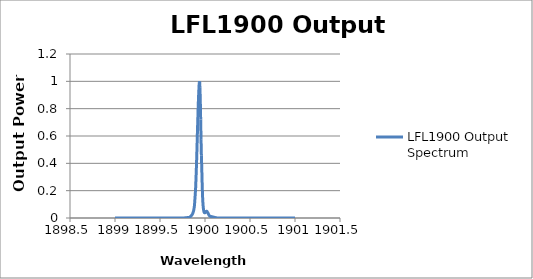
| Category | LFL1900 Output Spectrum |
|---|---|
| 1899.0 | 0 |
| 1899.004 | 0 |
| 1899.008 | 0 |
| 1899.012 | 0 |
| 1899.016 | 0 |
| 1899.02 | 0 |
| 1899.024 | 0 |
| 1899.028 | 0 |
| 1899.032 | 0 |
| 1899.036 | 0 |
| 1899.04 | 0 |
| 1899.044 | 0 |
| 1899.048 | 0 |
| 1899.052 | 0 |
| 1899.056 | 0 |
| 1899.06 | 0 |
| 1899.064 | 0 |
| 1899.068 | 0 |
| 1899.072 | 0 |
| 1899.076 | 0 |
| 1899.08 | 0 |
| 1899.084 | 0 |
| 1899.088 | 0 |
| 1899.092 | 0 |
| 1899.096 | 0 |
| 1899.1 | 0 |
| 1899.104 | 0 |
| 1899.108 | 0 |
| 1899.112 | 0 |
| 1899.116 | 0 |
| 1899.12 | 0 |
| 1899.124 | 0 |
| 1899.128 | 0 |
| 1899.132 | 0 |
| 1899.136 | 0 |
| 1899.14 | 0 |
| 1899.144 | 0 |
| 1899.148 | 0 |
| 1899.152 | 0 |
| 1899.156 | 0 |
| 1899.16 | 0 |
| 1899.164 | 0 |
| 1899.168 | 0 |
| 1899.172 | 0 |
| 1899.176 | 0 |
| 1899.18 | 0 |
| 1899.184 | 0 |
| 1899.188 | 0 |
| 1899.192 | 0 |
| 1899.196 | 0 |
| 1899.2 | 0 |
| 1899.204 | 0 |
| 1899.208 | 0 |
| 1899.212 | 0 |
| 1899.216 | 0 |
| 1899.22 | 0 |
| 1899.224 | 0 |
| 1899.228 | 0 |
| 1899.232 | 0 |
| 1899.236 | 0 |
| 1899.24 | 0 |
| 1899.244 | 0 |
| 1899.248 | 0 |
| 1899.252 | 0 |
| 1899.256 | 0 |
| 1899.26 | 0 |
| 1899.264 | 0 |
| 1899.268 | 0 |
| 1899.272 | 0 |
| 1899.276 | 0 |
| 1899.28 | 0 |
| 1899.284 | 0 |
| 1899.288 | 0 |
| 1899.292 | 0 |
| 1899.296 | 0 |
| 1899.3 | 0 |
| 1899.304 | 0 |
| 1899.308 | 0 |
| 1899.312 | 0 |
| 1899.316 | 0 |
| 1899.32 | 0 |
| 1899.324 | 0 |
| 1899.328 | 0 |
| 1899.332 | 0 |
| 1899.336 | 0 |
| 1899.34 | 0 |
| 1899.344 | 0 |
| 1899.348 | 0 |
| 1899.352 | 0 |
| 1899.356 | 0 |
| 1899.36 | 0 |
| 1899.364 | 0 |
| 1899.368 | 0 |
| 1899.372 | 0 |
| 1899.376 | 0 |
| 1899.38 | 0 |
| 1899.384 | 0 |
| 1899.388 | 0 |
| 1899.392 | 0 |
| 1899.396 | 0 |
| 1899.4 | 0 |
| 1899.404 | 0 |
| 1899.408 | 0 |
| 1899.412 | 0 |
| 1899.416 | 0 |
| 1899.42 | 0 |
| 1899.424 | 0 |
| 1899.428 | 0 |
| 1899.432 | 0 |
| 1899.436 | 0 |
| 1899.44 | 0 |
| 1899.444 | 0 |
| 1899.448 | 0 |
| 1899.452 | 0 |
| 1899.456 | 0 |
| 1899.46 | 0 |
| 1899.464 | 0 |
| 1899.468 | 0 |
| 1899.472 | 0 |
| 1899.476 | 0 |
| 1899.48 | 0 |
| 1899.484 | 0 |
| 1899.488 | 0 |
| 1899.492 | 0 |
| 1899.496 | 0 |
| 1899.5 | 0 |
| 1899.504 | 0 |
| 1899.508 | 0 |
| 1899.512 | 0 |
| 1899.516 | 0 |
| 1899.52 | 0 |
| 1899.524 | 0 |
| 1899.528 | 0 |
| 1899.532 | 0 |
| 1899.536 | 0 |
| 1899.54 | 0 |
| 1899.544 | 0 |
| 1899.548 | 0 |
| 1899.552 | 0 |
| 1899.556 | 0 |
| 1899.56 | 0 |
| 1899.564 | 0 |
| 1899.568 | 0 |
| 1899.572 | 0 |
| 1899.576 | 0 |
| 1899.58 | 0 |
| 1899.584 | 0 |
| 1899.588 | 0 |
| 1899.592 | 0 |
| 1899.596 | 0 |
| 1899.6 | 0 |
| 1899.604 | 0 |
| 1899.608 | 0 |
| 1899.612 | 0 |
| 1899.616 | 0 |
| 1899.62 | 0 |
| 1899.624 | 0 |
| 1899.628 | 0 |
| 1899.632 | 0 |
| 1899.636 | 0 |
| 1899.64 | 0 |
| 1899.644 | 0 |
| 1899.648 | 0 |
| 1899.652 | 0 |
| 1899.656 | 0 |
| 1899.66 | 0 |
| 1899.664 | 0 |
| 1899.668 | 0 |
| 1899.672 | 0 |
| 1899.676 | 0 |
| 1899.68 | 0 |
| 1899.684 | 0 |
| 1899.688 | 0 |
| 1899.692 | 0 |
| 1899.696 | 0 |
| 1899.7 | 0 |
| 1899.704 | 0 |
| 1899.708 | 0 |
| 1899.712 | 0 |
| 1899.716 | 0 |
| 1899.72 | 0 |
| 1899.724 | 0 |
| 1899.728 | 0 |
| 1899.732 | 0 |
| 1899.736 | 0 |
| 1899.74 | 0 |
| 1899.744 | 0.001 |
| 1899.748 | 0.001 |
| 1899.752 | 0.001 |
| 1899.756 | 0.001 |
| 1899.76 | 0.001 |
| 1899.764 | 0.001 |
| 1899.768 | 0.001 |
| 1899.772 | 0.001 |
| 1899.776 | 0.001 |
| 1899.78 | 0.001 |
| 1899.784 | 0.002 |
| 1899.788 | 0.002 |
| 1899.792 | 0.002 |
| 1899.796 | 0.003 |
| 1899.8 | 0.003 |
| 1899.804 | 0.003 |
| 1899.808 | 0.003 |
| 1899.812 | 0.003 |
| 1899.816 | 0.003 |
| 1899.82 | 0.004 |
| 1899.824 | 0.004 |
| 1899.828 | 0.005 |
| 1899.832 | 0.007 |
| 1899.836 | 0.009 |
| 1899.84 | 0.011 |
| 1899.844 | 0.013 |
| 1899.848 | 0.017 |
| 1899.852 | 0.021 |
| 1899.856 | 0.024 |
| 1899.86 | 0.028 |
| 1899.864 | 0.034 |
| 1899.868 | 0.041 |
| 1899.872 | 0.05 |
| 1899.876 | 0.061 |
| 1899.88 | 0.077 |
| 1899.884 | 0.1 |
| 1899.888 | 0.14 |
| 1899.892 | 0.176 |
| 1899.896 | 0.222 |
| 1899.9 | 0.289 |
| 1899.904 | 0.36 |
| 1899.908 | 0.444 |
| 1899.912 | 0.536 |
| 1899.916 | 0.633 |
| 1899.92 | 0.717 |
| 1899.924 | 0.807 |
| 1899.928 | 0.882 |
| 1899.932 | 0.939 |
| 1899.936 | 0.989 |
| 1899.94 | 1 |
| 1899.944 | 0.954 |
| 1899.948 | 0.856 |
| 1899.952 | 0.72 |
| 1899.956 | 0.572 |
| 1899.96 | 0.459 |
| 1899.964 | 0.368 |
| 1899.968 | 0.263 |
| 1899.972 | 0.176 |
| 1899.976 | 0.119 |
| 1899.98 | 0.082 |
| 1899.984 | 0.061 |
| 1899.988 | 0.047 |
| 1899.992 | 0.04 |
| 1899.996 | 0.038 |
| 1900.0 | 0.039 |
| 1900.004 | 0.041 |
| 1900.008 | 0.044 |
| 1900.012 | 0.047 |
| 1900.016 | 0.049 |
| 1900.02 | 0.049 |
| 1900.024 | 0.046 |
| 1900.028 | 0.041 |
| 1900.032 | 0.037 |
| 1900.036 | 0.032 |
| 1900.04 | 0.026 |
| 1900.044 | 0.021 |
| 1900.048 | 0.017 |
| 1900.052 | 0.015 |
| 1900.056 | 0.013 |
| 1900.06 | 0.012 |
| 1900.064 | 0.011 |
| 1900.068 | 0.011 |
| 1900.072 | 0.01 |
| 1900.076 | 0.01 |
| 1900.08 | 0.009 |
| 1900.084 | 0.008 |
| 1900.088 | 0.008 |
| 1900.092 | 0.007 |
| 1900.096 | 0.006 |
| 1900.1 | 0.006 |
| 1900.104 | 0.005 |
| 1900.108 | 0.004 |
| 1900.112 | 0.003 |
| 1900.116 | 0.003 |
| 1900.12 | 0.002 |
| 1900.124 | 0.002 |
| 1900.128 | 0.001 |
| 1900.132 | 0.001 |
| 1900.136 | 0.001 |
| 1900.14 | 0.001 |
| 1900.144 | 0.001 |
| 1900.148 | 0.001 |
| 1900.152 | 0 |
| 1900.156 | 0 |
| 1900.16 | 0 |
| 1900.164 | 0 |
| 1900.168 | 0 |
| 1900.172 | 0 |
| 1900.176 | 0 |
| 1900.18 | 0 |
| 1900.184 | 0 |
| 1900.188 | 0 |
| 1900.192 | 0 |
| 1900.196 | 0 |
| 1900.2 | 0 |
| 1900.204 | 0 |
| 1900.208 | 0 |
| 1900.212 | 0 |
| 1900.216 | 0 |
| 1900.22 | 0 |
| 1900.224 | 0 |
| 1900.228 | 0 |
| 1900.232 | 0 |
| 1900.236 | 0 |
| 1900.24 | 0 |
| 1900.244 | 0 |
| 1900.248 | 0 |
| 1900.252 | 0 |
| 1900.256 | 0 |
| 1900.26 | 0 |
| 1900.264 | 0 |
| 1900.268 | 0 |
| 1900.272 | 0 |
| 1900.276 | 0 |
| 1900.28 | 0 |
| 1900.284 | 0 |
| 1900.288 | 0 |
| 1900.292 | 0 |
| 1900.296 | 0 |
| 1900.3 | 0 |
| 1900.304 | 0 |
| 1900.308 | 0 |
| 1900.312 | 0 |
| 1900.316 | 0 |
| 1900.32 | 0 |
| 1900.324 | 0 |
| 1900.328 | 0 |
| 1900.332 | 0 |
| 1900.336 | 0 |
| 1900.34 | 0 |
| 1900.344 | 0 |
| 1900.348 | 0 |
| 1900.352 | 0 |
| 1900.356 | 0 |
| 1900.36 | 0 |
| 1900.364 | 0 |
| 1900.368 | 0 |
| 1900.372 | 0 |
| 1900.376 | 0 |
| 1900.38 | 0 |
| 1900.384 | 0 |
| 1900.388 | 0 |
| 1900.392 | 0 |
| 1900.396 | 0 |
| 1900.4 | 0 |
| 1900.404 | 0 |
| 1900.408 | 0 |
| 1900.412 | 0 |
| 1900.416 | 0 |
| 1900.42 | 0 |
| 1900.424 | 0 |
| 1900.428 | 0 |
| 1900.432 | 0 |
| 1900.436 | 0 |
| 1900.44 | 0 |
| 1900.444 | 0 |
| 1900.448 | 0 |
| 1900.452 | 0 |
| 1900.456 | 0 |
| 1900.46 | 0 |
| 1900.464 | 0 |
| 1900.468 | 0 |
| 1900.472 | 0 |
| 1900.476 | 0 |
| 1900.48 | 0 |
| 1900.484 | 0 |
| 1900.488 | 0 |
| 1900.492 | 0 |
| 1900.496 | 0 |
| 1900.5 | 0 |
| 1900.504 | 0 |
| 1900.508 | 0 |
| 1900.512 | 0 |
| 1900.516 | 0 |
| 1900.52 | 0 |
| 1900.524 | 0 |
| 1900.528 | 0 |
| 1900.532 | 0 |
| 1900.536 | 0 |
| 1900.54 | 0 |
| 1900.544 | 0 |
| 1900.548 | 0 |
| 1900.552 | 0 |
| 1900.556 | 0 |
| 1900.56 | 0 |
| 1900.564 | 0 |
| 1900.568 | 0 |
| 1900.572 | 0 |
| 1900.576 | 0 |
| 1900.58 | 0 |
| 1900.584 | 0 |
| 1900.588 | 0 |
| 1900.592 | 0 |
| 1900.596 | 0 |
| 1900.6 | 0 |
| 1900.604 | 0 |
| 1900.608 | 0 |
| 1900.612 | 0 |
| 1900.616 | 0 |
| 1900.62 | 0 |
| 1900.624 | 0 |
| 1900.628 | 0 |
| 1900.632 | 0 |
| 1900.636 | 0 |
| 1900.64 | 0 |
| 1900.644 | 0 |
| 1900.648 | 0 |
| 1900.652 | 0 |
| 1900.656 | 0 |
| 1900.66 | 0 |
| 1900.664 | 0 |
| 1900.668 | 0 |
| 1900.672 | 0 |
| 1900.676 | 0 |
| 1900.68 | 0 |
| 1900.684 | 0 |
| 1900.688 | 0 |
| 1900.692 | 0 |
| 1900.696 | 0 |
| 1900.7 | 0 |
| 1900.704 | 0 |
| 1900.708 | 0 |
| 1900.712 | 0 |
| 1900.716 | 0 |
| 1900.72 | 0 |
| 1900.724 | 0 |
| 1900.728 | 0 |
| 1900.732 | 0 |
| 1900.736 | 0 |
| 1900.74 | 0 |
| 1900.744 | 0 |
| 1900.748 | 0 |
| 1900.752 | 0 |
| 1900.756 | 0 |
| 1900.76 | 0 |
| 1900.764 | 0 |
| 1900.768 | 0 |
| 1900.772 | 0 |
| 1900.776 | 0 |
| 1900.78 | 0 |
| 1900.784 | 0 |
| 1900.788 | 0 |
| 1900.792 | 0 |
| 1900.796 | 0 |
| 1900.8 | 0 |
| 1900.804 | 0 |
| 1900.808 | 0 |
| 1900.812 | 0 |
| 1900.816 | 0 |
| 1900.82 | 0 |
| 1900.824 | 0 |
| 1900.828 | 0 |
| 1900.832 | 0 |
| 1900.836 | 0 |
| 1900.84 | 0 |
| 1900.844 | 0 |
| 1900.848 | 0 |
| 1900.852 | 0 |
| 1900.856 | 0 |
| 1900.86 | 0 |
| 1900.864 | 0 |
| 1900.868 | 0 |
| 1900.872 | 0 |
| 1900.876 | 0 |
| 1900.88 | 0 |
| 1900.884 | 0 |
| 1900.888 | 0 |
| 1900.892 | 0 |
| 1900.896 | 0 |
| 1900.9 | 0 |
| 1900.904 | 0 |
| 1900.908 | 0 |
| 1900.912 | 0 |
| 1900.916 | 0 |
| 1900.92 | 0 |
| 1900.924 | 0 |
| 1900.928 | 0 |
| 1900.932 | 0 |
| 1900.936 | 0 |
| 1900.94 | 0 |
| 1900.944 | 0 |
| 1900.948 | 0 |
| 1900.952 | 0 |
| 1900.956 | 0 |
| 1900.96 | 0 |
| 1900.964 | 0 |
| 1900.968 | 0 |
| 1900.972 | 0 |
| 1900.976 | 0 |
| 1900.98 | 0 |
| 1900.984 | 0 |
| 1900.988 | 0 |
| 1900.992 | 0 |
| 1900.996 | 0 |
| 1901.0 | 0 |